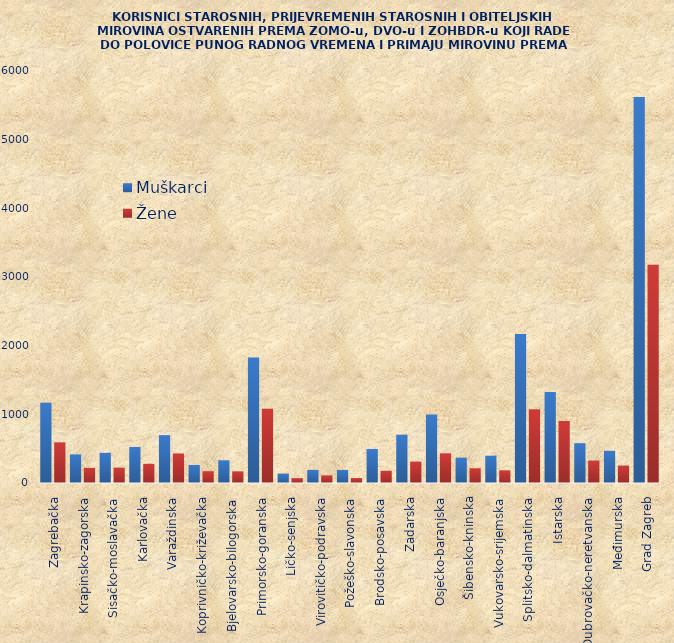
| Category | Muškarci | Žene |
|---|---|---|
| Zagrebačka | 1169 | 592 |
| Krapinsko-zagorska | 417 | 220 |
| Sisačko-moslavačka | 439 | 223 |
| Karlovačka | 524 | 279 |
| Varaždinska | 697 | 429 |
| Koprivničko-križevačka | 262 | 172 |
| Bjelovarsko-bilogorska | 331 | 170 |
| Primorsko-goranska | 1829 | 1083 |
| Ličko-senjska | 136 | 71 |
| Virovitičko-podravska | 191 | 111 |
| Požeško-slavonska | 190 | 72 |
| Brodsko-posavska | 495 | 178 |
| Zadarska | 703 | 311 |
| Osječko-baranjska | 998 | 432 |
| Šibensko-kninska | 368 | 215 |
| Vukovarsko-srijemska | 397 | 185 |
| Splitsko-dalmatinska | 2169 | 1075 |
| Istarska | 1326 | 903 |
| Dubrovačko-neretvanska | 580 | 326 |
| Međimurska | 468 | 253 |
| Grad Zagreb | 5623 | 3179 |